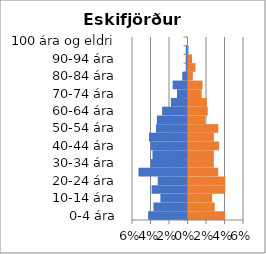
| Category | % karlar | %konur |
|---|---|---|
| 0-4 ára | -0.043 | 0.04 |
| 5-9 ára | -0.037 | 0.028 |
| 10-14 ára | -0.029 | 0.026 |
| 15-19 ára | -0.039 | 0.04 |
| 20-24 ára | -0.032 | 0.04 |
| 25-29 ára | -0.053 | 0.032 |
| 30-34 ára | -0.04 | 0.027 |
| 35-39 ára | -0.038 | 0.027 |
| 40-44 ára | -0.04 | 0.033 |
| 45-49 ára | -0.042 | 0.027 |
| 50-54 ára | -0.034 | 0.032 |
| 55-59 ára | -0.033 | 0.018 |
| 60-64 ára | -0.027 | 0.021 |
| 65-69 ára | -0.018 | 0.02 |
| 70-74 ára | -0.011 | 0.014 |
| 75-79 ára | -0.016 | 0.015 |
| 80-84 ára | -0.006 | 0.005 |
| 85-89 ára | -0.002 | 0.008 |
| 90-94 ára | -0.002 | 0.004 |
| 95-99 ára | -0.002 | 0 |
| 100 ára og eldri | 0 | 0 |